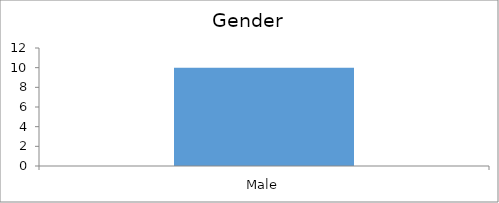
| Category | Gender |
|---|---|
| Male | 10 |